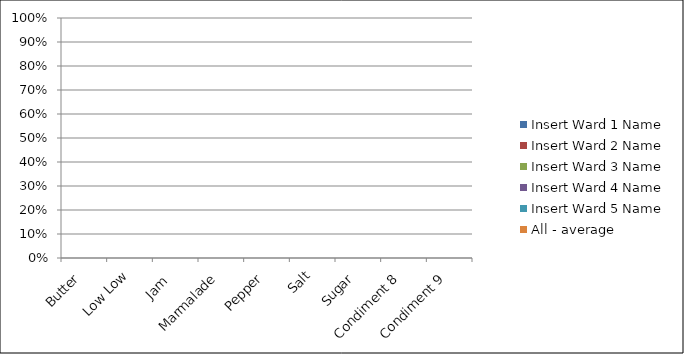
| Category | Insert Ward 1 Name | Insert Ward 2 Name | Insert Ward 3 Name | Insert Ward 4 Name | Insert Ward 5 Name | All - average |
|---|---|---|---|---|---|---|
| Butter | 0 | 0 | 0 | 0 | 0 | 0 |
| Low Low | 0 | 0 | 0 | 0 | 0 | 0 |
| Jam  | 0 | 0 | 0 | 0 | 0 | 0 |
| Marmalade | 0 | 0 | 0 | 0 | 0 | 0 |
| Pepper | 0 | 0 | 0 | 0 | 0 | 0 |
| Salt | 0 | 0 | 0 | 0 | 0 | 0 |
| Sugar | 0 | 0 | 0 | 0 | 0 | 0 |
| Condiment 8 | 0 | 0 | 0 | 0 | 0 | 0 |
| Condiment 9 | 0 | 0 | 0 | 0 | 0 | 0 |